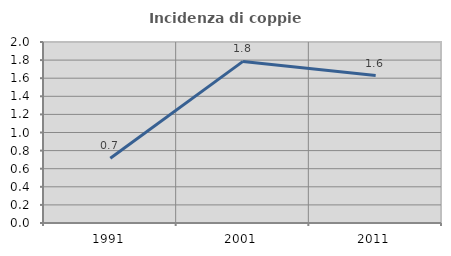
| Category | Incidenza di coppie miste |
|---|---|
| 1991.0 | 0.716 |
| 2001.0 | 1.786 |
| 2011.0 | 1.629 |